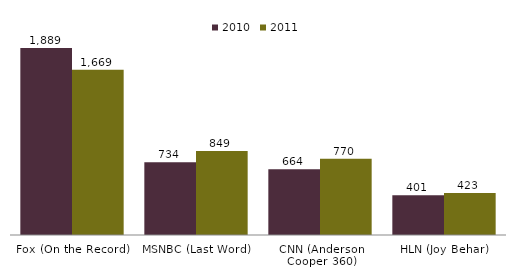
| Category | 2010 | 2011 |
|---|---|---|
| Fox (On the Record) | 1889 | 1669 |
| MSNBC (Last Word) | 734 | 849 |
| CNN (Anderson Cooper 360) | 664 | 770 |
| HLN (Joy Behar) | 401 | 423 |